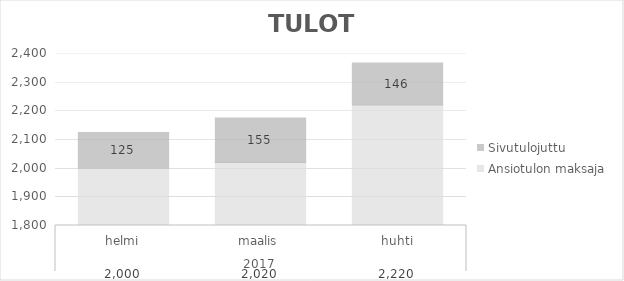
| Category | Ansiotulo - Ansiotulon maksaja | Sivutulot - Sivutulojuttu |
|---|---|---|
| 0 | 2000 | 124.7 |
| 1 | 2020 | 155.15 |
| 2 | 2220 | 146.45 |